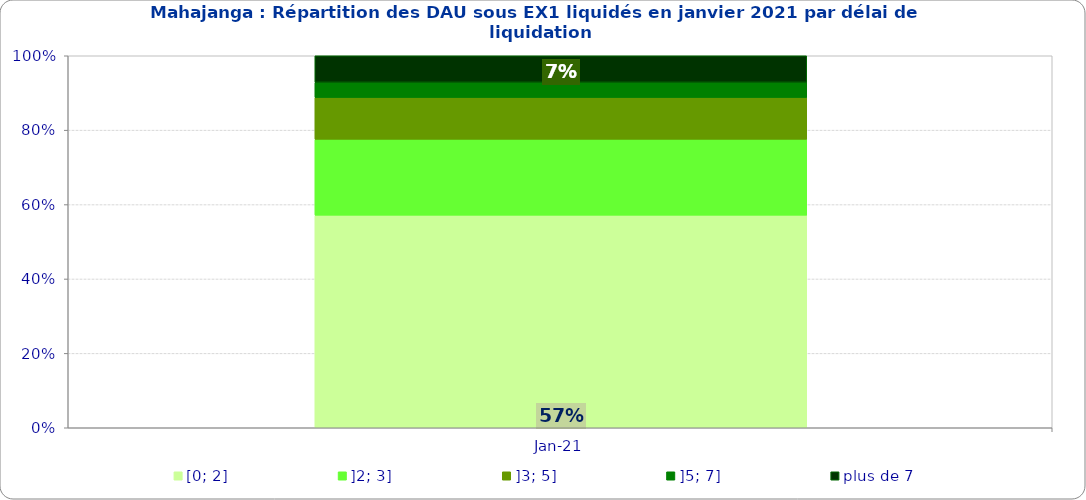
| Category | [0; 2] | ]2; 3] | ]3; 5] | ]5; 7] | plus de 7 |
|---|---|---|---|---|---|
| 2021-01-01 | 0.571 | 0.204 | 0.112 | 0.041 | 0.071 |